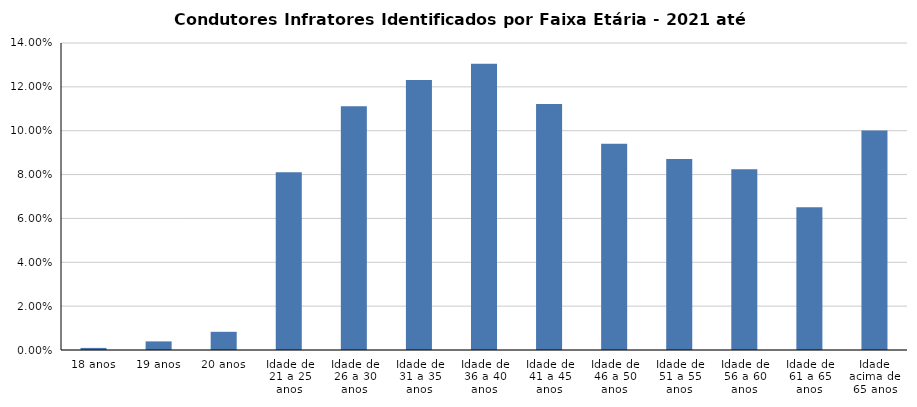
| Category | 2021 |
|---|---|
| 18 anos | 0.001 |
| 19 anos | 0.004 |
| 20 anos | 0.008 |
| Idade de 21 a 25 anos | 0.081 |
| Idade de 26 a 30 anos | 0.111 |
| Idade de 31 a 35 anos | 0.123 |
| Idade de 36 a 40 anos | 0.131 |
| Idade de 41 a 45 anos | 0.112 |
| Idade de 46 a 50 anos | 0.094 |
| Idade de 51 a 55 anos | 0.087 |
| Idade de 56 a 60 anos | 0.082 |
| Idade de 61 a 65 anos | 0.065 |
| Idade acima de 65 anos | 0.1 |